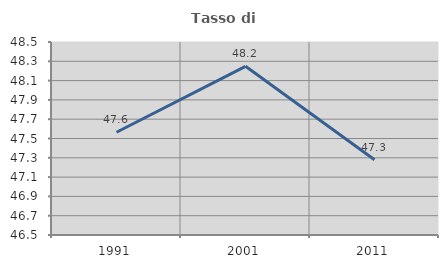
| Category | Tasso di occupazione   |
|---|---|
| 1991.0 | 47.564 |
| 2001.0 | 48.248 |
| 2011.0 | 47.279 |